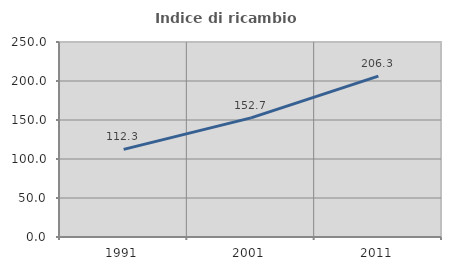
| Category | Indice di ricambio occupazionale  |
|---|---|
| 1991.0 | 112.327 |
| 2001.0 | 152.68 |
| 2011.0 | 206.268 |